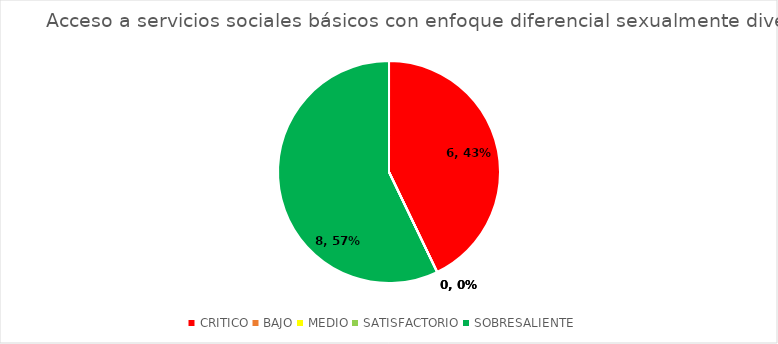
| Category | Acceso a servicios sociales básicos con enfoque diferencial sexualmente diverso |
|---|---|
| CRITICO | 6 |
| BAJO | 0 |
| MEDIO | 0 |
| SATISFACTORIO | 0 |
| SOBRESALIENTE | 8 |